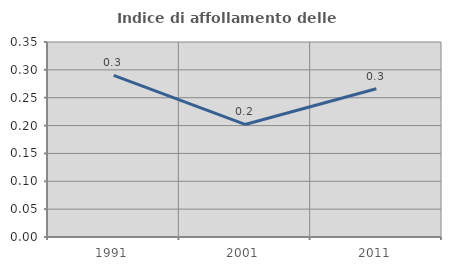
| Category | Indice di affollamento delle abitazioni  |
|---|---|
| 1991.0 | 0.29 |
| 2001.0 | 0.202 |
| 2011.0 | 0.266 |